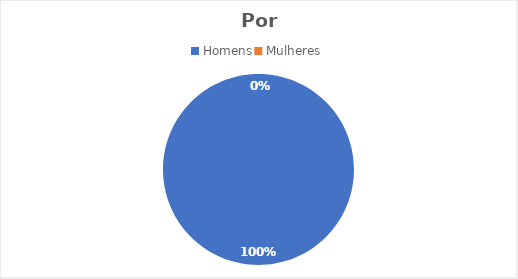
| Category | Series 0 |
|---|---|
| Homens | 22 |
| Mulheres | 0 |